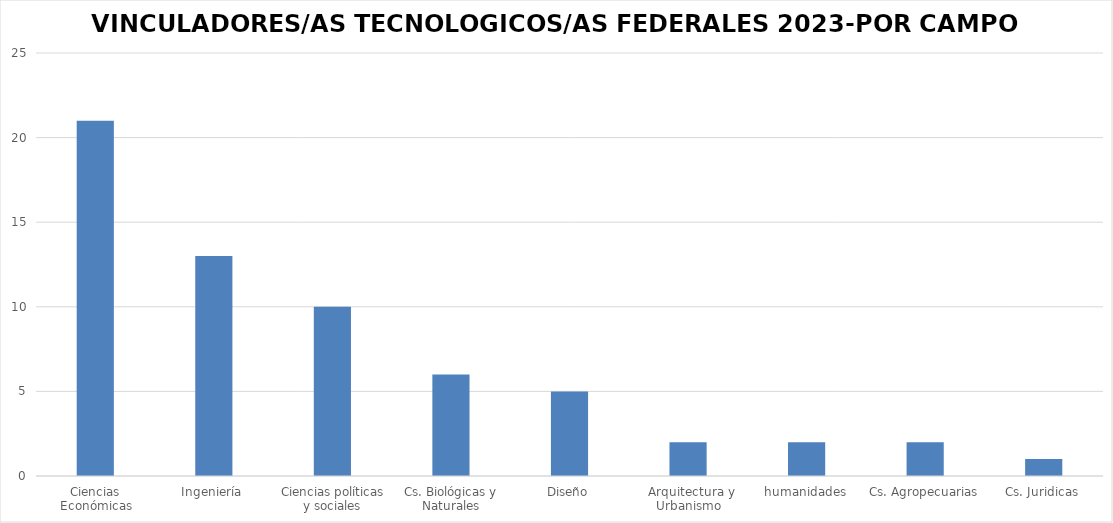
| Category | Total |
|---|---|
| Ciencias Económicas | 21 |
| Ingeniería | 13 |
| Ciencias políticas y sociales | 10 |
| Cs. Biológicas y Naturales | 6 |
| Diseño, Arquitectura y Urbanismo | 5 |
| humanidades | 2 |
| Cs. Agropecuarias | 2 |
| Cs. Juridicas | 2 |
| Filosofia y Letras | 1 |